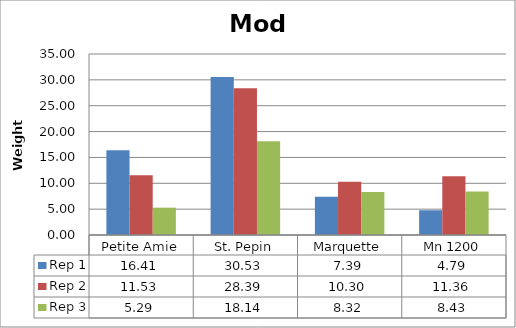
| Category | Rep 1 | Rep 2 | Rep 3 |
|---|---|---|---|
| 0 | 16.411 | 11.533 | 5.289 |
| 1 | 30.533 | 28.389 | 18.144 |
| 2 | 7.389 | 10.3 | 8.322 |
| 3 | 4.789 | 11.356 | 8.43 |